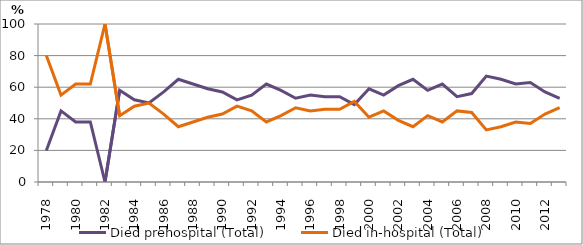
| Category | Died prehospital (Total) | Died in-hospital (Total) |
|---|---|---|
| 1978.0 | 20 | 80 |
| 1979.0 | 45 | 55 |
| 1980.0 | 38 | 62 |
| 1981.0 | 38 | 62 |
| 1982.0 | 0 | 100 |
| 1983.0 | 58 | 42 |
| 1984.0 | 52 | 48 |
| 1985.0 | 50 | 50 |
| 1986.0 | 57 | 43 |
| 1987.0 | 65 | 35 |
| 1988.0 | 62 | 38 |
| 1989.0 | 59 | 41 |
| 1990.0 | 57 | 43 |
| 1991.0 | 52 | 48 |
| 1992.0 | 55 | 45 |
| 1993.0 | 62 | 38 |
| 1994.0 | 58 | 42 |
| 1995.0 | 53 | 47 |
| 1996.0 | 55 | 45 |
| 1997.0 | 54 | 46 |
| 1998.0 | 54 | 46 |
| 1999.0 | 49 | 51 |
| 2000.0 | 59 | 41 |
| 2001.0 | 55 | 45 |
| 2002.0 | 61 | 39 |
| 2003.0 | 65 | 35 |
| 2004.0 | 58 | 42 |
| 2005.0 | 62 | 38 |
| 2006.0 | 54 | 45 |
| 2007.0 | 56 | 44 |
| 2008.0 | 67 | 33 |
| 2009.0 | 65 | 35 |
| 2010.0 | 62 | 38 |
| 2011.0 | 63 | 37 |
| 2012.0 | 57 | 43 |
| 2013.0 | 53 | 47 |